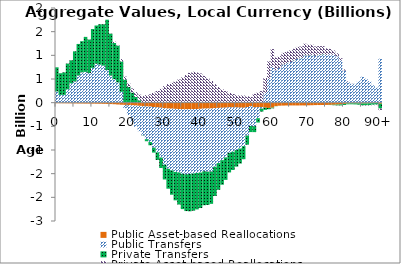
| Category | Public Asset-based Reallocations | Public Transfers | Private Transfers | Private Asset-based Reallocations |
|---|---|---|---|---|
| 0 | -11.462 | 237.22 | 509.711 | 0 |
|  | -12.186 | 164.678 | 456.838 | 0 |
| 2 | -12.861 | 164.651 | 475.481 | 0 |
| 3 | -13.872 | 282.303 | 544.07 | 0 |
| 4 | -14.334 | 409.184 | 486.021 | 0 |
| 5 | -15.589 | 447.209 | 637.599 | 0 |
| 6 | -16.869 | 573.697 | 667.164 | 0 |
| 7 | -17.844 | 640.375 | 658.056 | 0 |
| 8 | -18.966 | 650.205 | 739.528 | 0 |
| 9 | -19.421 | 625.148 | 708.069 | 0 |
| 10 | -20.371 | 736.264 | 819.198 | 0 |
| 11 | -21.409 | 822.175 | 808.001 | 0 |
| 12 | -22.463 | 803.33 | 853.349 | 0 |
| 13 | -24.269 | 782.158 | 874.664 | 0 |
| 14 | -26.551 | 687.779 | 1064.893 | 0 |
| 15 | -29.564 | 572.966 | 885.682 | 0 |
| 16 | -32.959 | 496.249 | 764.371 | 27.76 |
| 17 | -38.351 | 429.54 | 778.808 | 11.221 |
| 18 | -43.238 | 229.354 | 640.828 | 51.321 |
| 19 | -47.627 | -68.676 | 486.278 | 63.951 |
| 20 | -50.958 | -210.98 | 332.736 | 74.316 |
| 21 | -55.876 | -354.267 | 214.272 | 86.907 |
| 22 | -61.327 | -450.289 | 120.433 | 102.162 |
| 23 | -67.175 | -535.901 | 49.123 | 120.258 |
| 24 | -73.882 | -621.153 | -5.967 | 139.274 |
| 25 | -79.55 | -691.592 | -43.544 | 158.029 |
| 26 | -83.63 | -748.251 | -68.05 | 176.058 |
| 27 | -92.716 | -856.009 | -106.129 | 212.166 |
| 28 | -99.733 | -951.619 | -158.347 | 246.932 |
| 29 | -107.084 | -1052.756 | -219.871 | 290.035 |
| 30 | -118.698 | -1192.489 | -311.471 | 349.424 |
| 31 | -125.14 | -1272.064 | -420.497 | 392.575 |
| 32 | -128.057 | -1303.282 | -513.199 | 417.716 |
| 33 | -131.265 | -1332.103 | -600.028 | 448.921 |
| 34 | -134.078 | -1341.051 | -677.067 | 489.301 |
| 35 | -137.891 | -1365.246 | -745.859 | 533.287 |
| 36 | -139.488 | -1372.872 | -777.701 | 583.649 |
| 37 | -138.632 | -1366.801 | -789.621 | 629.526 |
| 38 | -137.036 | -1358.843 | -787.072 | 653.737 |
| 39 | -133.28 | -1351.2 | -770.657 | 637.134 |
| 40 | -130.163 | -1345.724 | -750.502 | 616.595 |
| 41 | -125.596 | -1322.828 | -718.355 | 566.698 |
| 42 | -124.588 | -1331.922 | -703.958 | 511.071 |
| 43 | -123.87 | -1328.774 | -684.952 | 457.924 |
| 44 | -116.149 | -1236.455 | -619.697 | 390.616 |
| 45 | -111.005 | -1165.266 | -564.456 | 331.537 |
| 46 | -107.139 | -1107.649 | -518.028 | 279.512 |
| 47 | -104.899 | -1051.747 | -474.37 | 245.38 |
| 48 | -98.758 | -960.981 | -414.173 | 206.151 |
| 49 | -100.343 | -937.369 | -384.687 | 182.576 |
| 50 | -100.677 | -900.198 | -350.084 | 157.978 |
| 51 | -104.698 | -864.181 | -317.032 | 152.963 |
| 52 | -107.285 | -810.974 | -276.394 | 150.798 |
| 53 | -91.211 | -603.18 | -193.834 | 134.07 |
| 54 | -75.792 | -416.887 | -128.629 | 122.522 |
| 55 | -98.264 | -398.014 | -125.865 | 186.169 |
| 56 | -96.367 | -231.896 | -91.477 | 212.029 |
| 57 | -94.108 | -32.057 | -62.934 | 243.658 |
| 58 | -106.418 | 208.838 | -45.287 | 312.04 |
| 59 | -111.833 | 506.115 | -27.37 | 365.652 |
| 60 | -105.517 | 757.549 | -14.686 | 374.833 |
| 61 | -71.849 | 683.921 | -3.466 | 271.489 |
| 62 | -63.744 | 734.938 | 1.342 | 247.286 |
| 63 | -61.559 | 804.493 | 2.509 | 245.329 |
| 64 | -59.258 | 836.267 | 2.092 | 240.608 |
| 65 | -58.391 | 858.612 | 2.982 | 241.095 |
| 66 | -58.479 | 890.184 | 3.587 | 244.638 |
| 67 | -59.098 | 925.606 | 3.026 | 248.722 |
| 68 | -58.02 | 941.289 | 3.062 | 242.886 |
| 69 | -58.482 | 996.774 | 3.263 | 245.002 |
| 70 | -55.576 | 991.386 | 4.463 | 230.005 |
| 71 | -54.029 | 1005.504 | 3.831 | 216.218 |
| 72 | -51.085 | 987.221 | 4.014 | 196.964 |
| 73 | -50.203 | 1005.745 | 4.694 | 185.27 |
| 74 | -49.736 | 1022.155 | 5.148 | 167.574 |
| 75 | -47.27 | 1007.476 | 1.285 | 138.406 |
| 76 | -45.971 | 1021.889 | -4.157 | 114.658 |
| 77 | -43.73 | 1012.674 | -9.871 | 91.151 |
| 78 | -40.697 | 976.563 | -16.567 | 66.925 |
| 79 | -35.927 | 894.644 | -22.068 | 44.987 |
| 80 | -26.295 | 678.569 | -22.443 | 24.885 |
| 81 | -16.526 | 441.194 | -18.349 | 10.552 |
| 82 | -14.342 | 398.362 | -20.094 | 4.496 |
| 83 | -13.722 | 398.307 | -22.937 | 0.131 |
| 84 | -14.956 | 454.373 | -29.506 | -3.801 |
| 85 | -17.212 | 547.263 | -38.828 | -8.032 |
| 86 | -15.154 | 507.029 | -39.108 | -9.809 |
| 87 | -12.915 | 454.899 | -38.261 | -10.776 |
| 88 | -9.931 | 367.618 | -34.062 | -10.306 |
| 89 | -8.183 | 319.2 | -32.385 | -10.323 |
| 90+ | -22.578 | 928.535 | -102.047 | -33.863 |